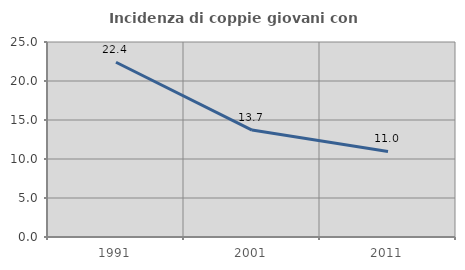
| Category | Incidenza di coppie giovani con figli |
|---|---|
| 1991.0 | 22.405 |
| 2001.0 | 13.706 |
| 2011.0 | 10.968 |